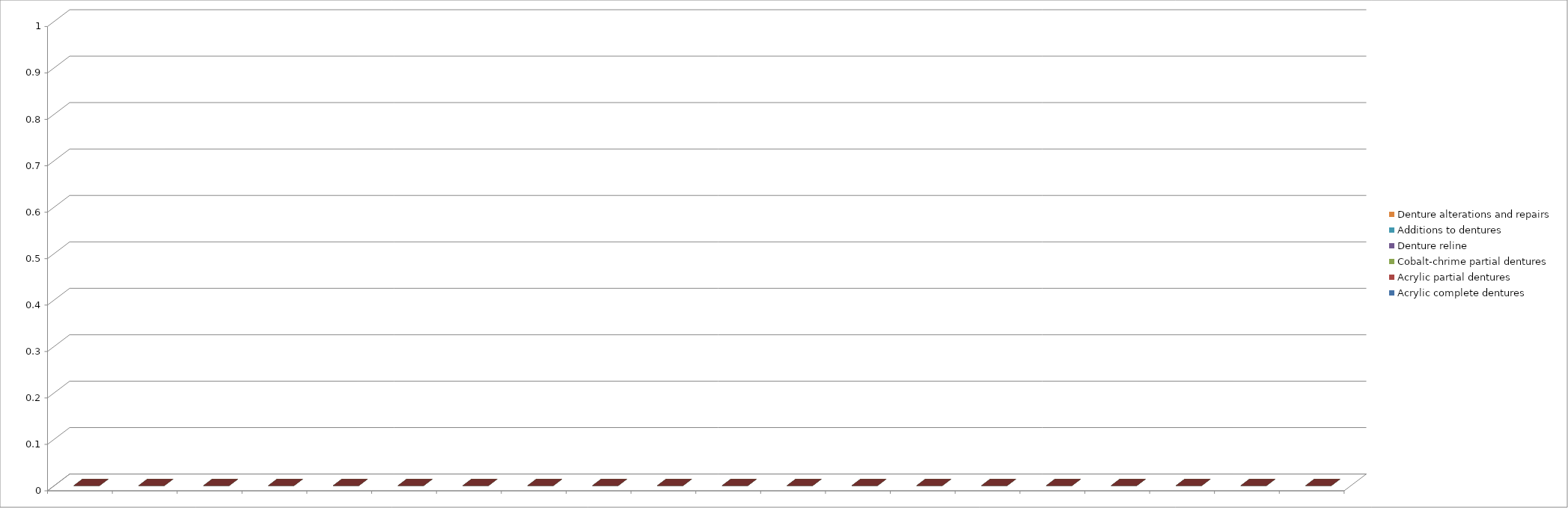
| Category | Acrylic complete dentures | Acrylic partial dentures | Cobalt-chrime partial dentures | Denture reline | Additions to dentures | Denture alterations and repairs |
|---|---|---|---|---|---|---|
| 0 | 0 | 0 | 0 | 0 | 0 | 0 |
| 1 | 0 | 0 | 0 | 0 | 0 | 0 |
| 2 | 0 | 0 | 0 | 0 | 0 | 0 |
| 3 | 0 | 0 | 0 | 0 | 0 | 0 |
| 4 | 0 | 0 | 0 | 0 | 0 | 0 |
| 5 | 0 | 0 | 0 | 0 | 0 | 0 |
| 6 | 0 | 0 | 0 | 0 | 0 | 0 |
| 7 | 0 | 0 | 0 | 0 | 0 | 0 |
| 8 | 0 | 0 | 0 | 0 | 0 | 0 |
| 9 | 0 | 0 | 0 | 0 | 0 | 0 |
| 10 | 0 | 0 | 0 | 0 | 0 | 0 |
| 11 | 0 | 0 | 0 | 0 | 0 | 0 |
| 12 | 0 | 0 | 0 | 0 | 0 | 0 |
| 13 | 0 | 0 | 0 | 0 | 0 | 0 |
| 14 | 0 | 0 | 0 | 0 | 0 | 0 |
| 15 | 0 | 0 | 0 | 0 | 0 | 0 |
| 16 | 0 | 0 | 0 | 0 | 0 | 0 |
| 17 | 0 | 0 | 0 | 0 | 0 | 0 |
| 18 | 0 | 0 | 0 | 0 | 0 | 0 |
| 19 | 0 | 0 | 0 | 0 | 0 | 0 |